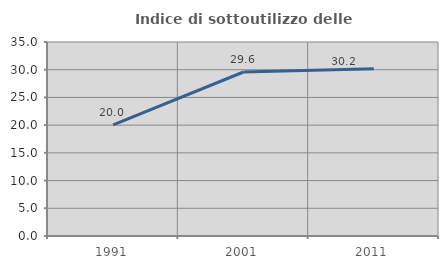
| Category | Indice di sottoutilizzo delle abitazioni  |
|---|---|
| 1991.0 | 20.047 |
| 2001.0 | 29.588 |
| 2011.0 | 30.182 |